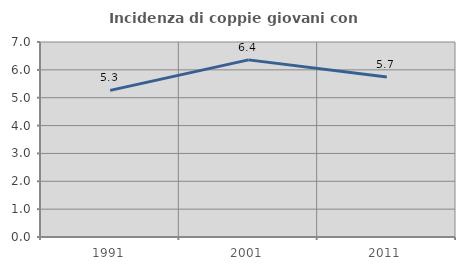
| Category | Incidenza di coppie giovani con figli |
|---|---|
| 1991.0 | 5.263 |
| 2001.0 | 6.358 |
| 2011.0 | 5.747 |